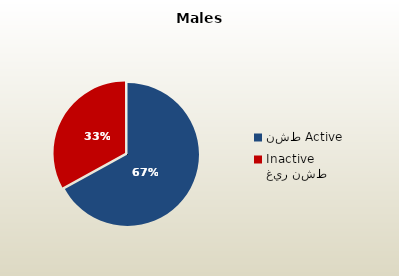
| Category | الذكور القطريين  Qatari Males |
|---|---|
| نشط Active | 69530 |
| غير نشط Inactive | 34255 |